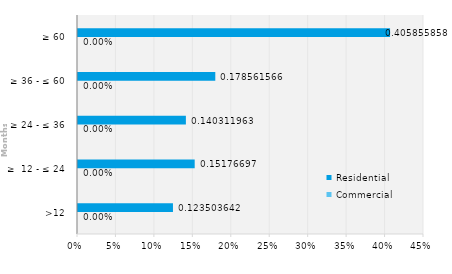
| Category | Commercial | Residential |
|---|---|---|
| >12 | 0 | 0.124 |
| ≥  12 - ≤ 24 | 0 | 0.152 |
| ≥ 24 - ≤ 36 | 0 | 0.14 |
| ≥ 36 - ≤ 60 | 0 | 0.179 |
| ≥ 60 | 0 | 0.406 |